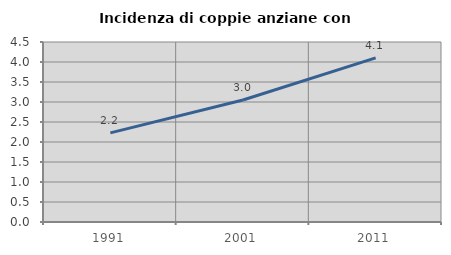
| Category | Incidenza di coppie anziane con figli |
|---|---|
| 1991.0 | 2.229 |
| 2001.0 | 3.049 |
| 2011.0 | 4.103 |